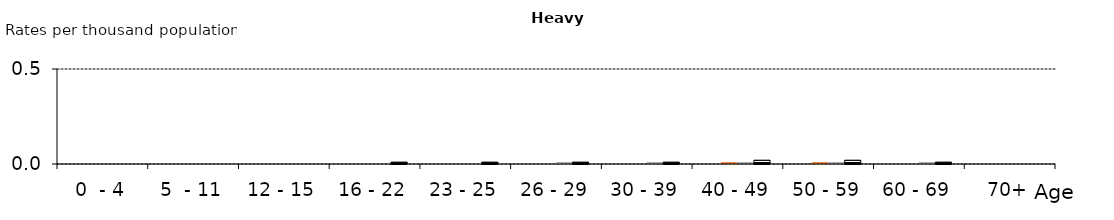
| Category | Killed | Adjusted serious | Adjusted slight | All Severities |
|---|---|---|---|---|
| 0  - 4 | 0 | 0 | 0 | 0 |
| 5  - 11 | 0 | 0 | 0 | 0 |
| 12 - 15 | 0 | 0 | 0 | 0 |
| 16 - 22 | 0 | 0 | 0 | 0.01 |
| 23 - 25 | 0 | 0 | 0 | 0.01 |
| 26 - 29 | 0 | 0 | 0.01 | 0.01 |
| 30 - 39 | 0 | 0 | 0.01 | 0.01 |
| 40 - 49 | 0 | 0.01 | 0.01 | 0.02 |
| 50 - 59 | 0 | 0.01 | 0.01 | 0.02 |
| 60 - 69 | 0 | 0 | 0.01 | 0.01 |
| 70+ | 0 | 0 | 0 | 0 |